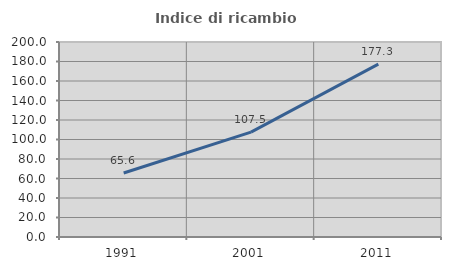
| Category | Indice di ricambio occupazionale  |
|---|---|
| 1991.0 | 65.625 |
| 2001.0 | 107.547 |
| 2011.0 | 177.273 |